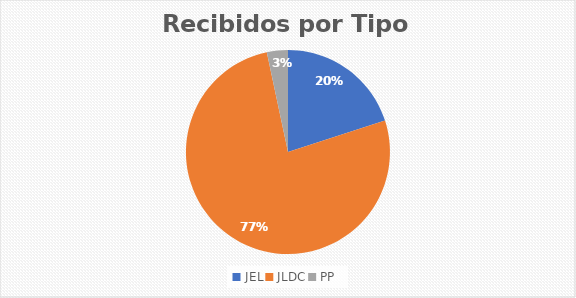
| Category | Series 0 |
|---|---|
| JEL | 6 |
| JLDC | 23 |
| PP | 1 |